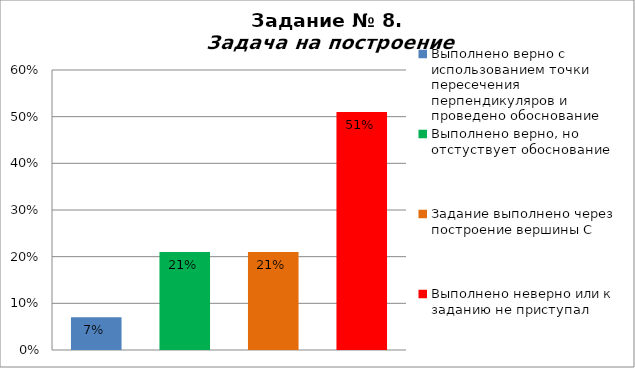
| Category | Задача на построение |
|---|---|
| Выполнено верно с использованием точки пересечения перпендикуляров и проведено обоснование | 0.07 |
| Выполнено верно, но отстуствует обоснование | 0.21 |
| Задание выполнено через построение вершины С | 0.21 |
| Выполнено неверно или к заданию не приступал | 0.51 |